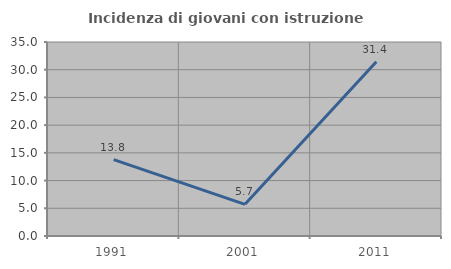
| Category | Incidenza di giovani con istruzione universitaria |
|---|---|
| 1991.0 | 13.793 |
| 2001.0 | 5.714 |
| 2011.0 | 31.429 |